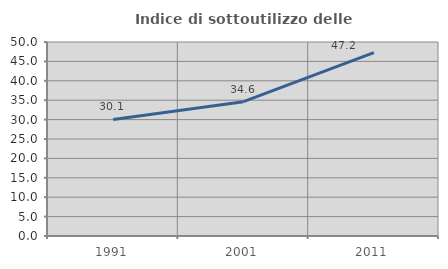
| Category | Indice di sottoutilizzo delle abitazioni  |
|---|---|
| 1991.0 | 30.051 |
| 2001.0 | 34.624 |
| 2011.0 | 47.241 |